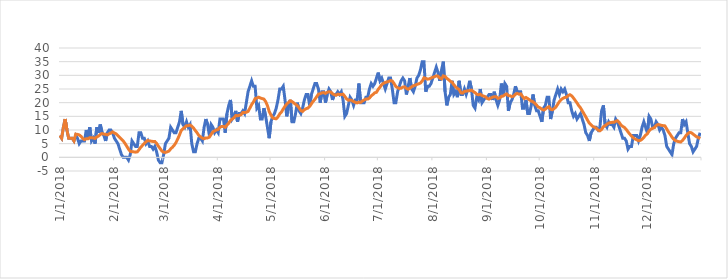
| Category | TEMPERATURE | Moyenne |
|---|---|---|
| 1/1/18 | 8 | 8 |
| 1/2/18 | 7 | 7 |
| 1/3/18 | 11 | 11 |
| 1/4/18 | 14 | 14 |
| 1/5/18 | 10 | 10 |
| 1/6/18 | 7 | 7 |
| 1/7/18 | 7 | 7 |
| 1/8/18 | 7 | 7 |
| 1/9/18 | 6 | 6 |
| 1/10/18 | 8 | 8.5 |
| 1/11/18 | 7 | 8.4 |
| 1/12/18 | 5 | 8.2 |
| 1/13/18 | 6 | 7.7 |
| 1/14/18 | 6 | 6.9 |
| 1/15/18 | 6 | 6.5 |
| 1/16/18 | 10 | 6.8 |
| 1/17/18 | 7 | 6.8 |
| 1/18/18 | 11 | 7.2 |
| 1/19/18 | 6 | 7.2 |
| 1/20/18 | 7 | 7.1 |
| 1/21/18 | 5 | 6.9 |
| 1/22/18 | 11 | 7.5 |
| 1/23/18 | 9 | 7.8 |
| 1/24/18 | 12 | 8.4 |
| 1/25/18 | 9 | 8.7 |
| 1/26/18 | 8 | 8.5 |
| 1/27/18 | 6 | 8.4 |
| 1/28/18 | 9 | 8.2 |
| 1/29/18 | 10 | 8.6 |
| 1/30/18 | 10 | 8.9 |
| 1/31/18 | 9 | 9.3 |
| 2/1/18 | 7 | 8.9 |
| 2/2/18 | 6 | 8.6 |
| 2/3/18 | 5 | 7.9 |
| 2/4/18 | 3 | 7.3 |
| 2/5/18 | 1 | 6.6 |
| 2/6/18 | 0 | 6 |
| 2/7/18 | 0 | 5.1 |
| 2/8/18 | 0 | 4.1 |
| 2/9/18 | -1 | 3 |
| 2/10/18 | 1 | 2.2 |
| 2/11/18 | 6 | 2.1 |
| 2/12/18 | 5 | 2 |
| 2/13/18 | 4 | 1.9 |
| 2/14/18 | 4 | 2 |
| 2/15/18 | 9 | 2.8 |
| 2/16/18 | 9 | 3.7 |
| 2/17/18 | 7 | 4.4 |
| 2/18/18 | 7 | 5.1 |
| 2/19/18 | 5 | 5.7 |
| 2/20/18 | 6 | 6.2 |
| 2/21/18 | 4 | 6 |
| 2/22/18 | 4 | 5.9 |
| 2/23/18 | 3 | 5.8 |
| 2/24/18 | 4 | 5.8 |
| 2/25/18 | 2 | 5.1 |
| 2/26/18 | -1 | 4.1 |
| 2/27/18 | -2 | 3.2 |
| 2/28/18 | -2 | 2.3 |
| 3/1/18 | 1 | 1.9 |
| 3/2/18 | 5 | 1.8 |
| 3/3/18 | 6 | 2 |
| 3/4/18 | 7 | 2.3 |
| 3/5/18 | 11 | 3.1 |
| 3/6/18 | 10 | 3.7 |
| 3/7/18 | 9 | 4.4 |
| 3/8/18 | 9 | 5.4 |
| 3/9/18 | 11 | 6.7 |
| 3/10/18 | 13 | 8.2 |
| 3/11/18 | 17 | 9.8 |
| 3/12/18 | 12 | 10.5 |
| 3/13/18 | 11 | 11 |
| 3/14/18 | 13 | 11.6 |
| 3/15/18 | 11 | 11.6 |
| 3/16/18 | 12 | 11.8 |
| 3/17/18 | 5 | 11.4 |
| 3/18/18 | 2 | 10.7 |
| 3/19/18 | 2 | 9.8 |
| 3/20/18 | 5 | 9 |
| 3/21/18 | 7 | 8 |
| 3/22/18 | 7 | 7.5 |
| 3/23/18 | 6 | 7 |
| 3/24/18 | 11 | 6.8 |
| 3/25/18 | 14 | 7.1 |
| 3/26/18 | 12 | 7.1 |
| 3/27/18 | 8 | 7.4 |
| 3/28/18 | 12 | 8.4 |
| 3/29/18 | 11 | 9.3 |
| 3/30/18 | 9 | 9.7 |
| 3/31/18 | 10 | 10 |
| 4/1/18 | 9 | 10.2 |
| 4/2/18 | 14 | 11 |
| 4/3/18 | 14 | 11.3 |
| 4/4/18 | 14 | 11.3 |
| 4/5/18 | 9 | 11 |
| 4/6/18 | 16 | 11.8 |
| 4/7/18 | 19 | 12.5 |
| 4/8/18 | 21 | 13.5 |
| 4/9/18 | 14 | 14 |
| 4/10/18 | 15 | 14.5 |
| 4/11/18 | 17 | 15.3 |
| 4/12/18 | 13 | 15.2 |
| 4/13/18 | 16 | 15.4 |
| 4/14/18 | 16 | 15.6 |
| 4/15/18 | 17 | 16.4 |
| 4/16/18 | 16 | 16.4 |
| 4/17/18 | 20 | 16.5 |
| 4/18/18 | 24 | 16.8 |
| 4/19/18 | 26 | 18 |
| 4/20/18 | 28 | 19.3 |
| 4/21/18 | 26 | 20.2 |
| 4/22/18 | 26 | 21.5 |
| 4/23/18 | 18 | 21.7 |
| 4/24/18 | 19 | 22 |
| 4/25/18 | 14 | 21.7 |
| 4/26/18 | 14 | 21.5 |
| 4/27/18 | 18 | 21.3 |
| 4/28/18 | 15 | 20.4 |
| 4/29/18 | 11 | 18.9 |
| 4/30/18 | 7 | 16.8 |
| 5/1/18 | 13 | 15.5 |
| 5/2/18 | 15 | 14.4 |
| 5/3/18 | 16 | 14.2 |
| 5/4/18 | 18 | 14.1 |
| 5/5/18 | 21 | 14.8 |
| 5/6/18 | 25 | 15.9 |
| 5/7/18 | 25 | 16.6 |
| 5/8/18 | 26 | 17.7 |
| 5/9/18 | 21 | 18.7 |
| 5/10/18 | 15 | 19.5 |
| 5/11/18 | 19 | 20.1 |
| 5/12/18 | 21 | 20.7 |
| 5/13/18 | 13 | 20.4 |
| 5/14/18 | 13 | 19.9 |
| 5/15/18 | 16 | 19.4 |
| 5/16/18 | 20 | 18.9 |
| 5/17/18 | 17 | 18.1 |
| 5/18/18 | 16 | 17.1 |
| 5/19/18 | 18 | 16.8 |
| 5/20/18 | 21 | 17.4 |
| 5/21/18 | 23 | 17.8 |
| 5/22/18 | 23 | 18 |
| 5/23/18 | 19 | 18.6 |
| 5/24/18 | 23 | 19.6 |
| 5/25/18 | 25 | 20.5 |
| 5/26/18 | 27 | 21.2 |
| 5/27/18 | 27 | 22.2 |
| 5/28/18 | 25 | 23.1 |
| 5/29/18 | 20 | 23.3 |
| 5/30/18 | 24 | 23.6 |
| 5/31/18 | 24 | 23.7 |
| 6/1/18 | 20 | 23.4 |
| 6/2/18 | 23 | 23.8 |
| 6/3/18 | 25 | 24 |
| 6/4/18 | 24 | 23.9 |
| 6/5/18 | 21 | 23.3 |
| 6/6/18 | 23 | 22.9 |
| 6/7/18 | 23 | 22.7 |
| 6/8/18 | 24 | 23.1 |
| 6/9/18 | 23 | 23 |
| 6/10/18 | 24 | 23 |
| 6/11/18 | 21 | 23.1 |
| 6/12/18 | 15 | 22.3 |
| 6/13/18 | 16 | 21.4 |
| 6/14/18 | 19 | 20.9 |
| 6/15/18 | 22 | 21 |
| 6/16/18 | 21 | 20.8 |
| 6/17/18 | 19 | 20.4 |
| 6/18/18 | 21 | 20.1 |
| 6/19/18 | 21 | 19.9 |
| 6/20/18 | 27 | 20.2 |
| 6/21/18 | 20 | 20.1 |
| 6/22/18 | 20 | 20.6 |
| 6/23/18 | 20 | 21 |
| 6/24/18 | 22 | 21.3 |
| 6/25/18 | 22 | 21.3 |
| 6/26/18 | 25 | 21.7 |
| 6/27/18 | 27 | 22.5 |
| 6/28/18 | 26 | 23 |
| 6/29/18 | 27 | 23.6 |
| 6/30/18 | 29 | 23.8 |
| 7/1/18 | 31 | 24.9 |
| 7/2/18 | 28 | 25.7 |
| 7/3/18 | 29 | 26.6 |
| 7/4/18 | 27 | 27.1 |
| 7/5/18 | 25 | 27.4 |
| 7/6/18 | 27 | 27.6 |
| 7/7/18 | 29 | 27.8 |
| 7/8/18 | 29 | 28.1 |
| 7/9/18 | 25 | 27.9 |
| 7/10/18 | 20 | 27 |
| 7/11/18 | 20 | 25.9 |
| 7/12/18 | 24 | 25.5 |
| 7/13/18 | 26 | 25.2 |
| 7/14/18 | 28 | 25.3 |
| 7/15/18 | 29 | 25.7 |
| 7/16/18 | 28 | 25.8 |
| 7/17/18 | 23 | 25.2 |
| 7/18/18 | 26 | 24.9 |
| 7/19/18 | 29 | 25.3 |
| 7/20/18 | 25 | 25.8 |
| 7/21/18 | 24 | 26.2 |
| 7/22/18 | 26 | 26.4 |
| 7/23/18 | 29 | 26.7 |
| 7/24/18 | 30 | 26.9 |
| 7/25/18 | 32 | 27.2 |
| 7/26/18 | 35 | 27.9 |
| 7/27/18 | 35 | 29.1 |
| 7/28/18 | 24 | 28.9 |
| 7/29/18 | 26 | 28.6 |
| 7/30/18 | 26 | 28.7 |
| 7/31/18 | 27 | 29 |
| 8/1/18 | 29 | 29.3 |
| 8/2/18 | 31 | 29.5 |
| 8/3/18 | 33 | 29.8 |
| 8/4/18 | 31 | 29.7 |
| 8/5/18 | 28 | 29 |
| 8/6/18 | 32 | 28.7 |
| 8/7/18 | 35 | 29.8 |
| 8/8/18 | 24 | 29.6 |
| 8/9/18 | 19 | 28.9 |
| 8/10/18 | 22 | 28.4 |
| 8/11/18 | 23 | 27.8 |
| 8/12/18 | 28 | 27.5 |
| 8/13/18 | 23 | 26.5 |
| 8/14/18 | 24 | 25.8 |
| 8/15/18 | 22 | 25.2 |
| 8/16/18 | 28 | 24.8 |
| 8/17/18 | 23 | 23.6 |
| 8/18/18 | 23 | 23.5 |
| 8/19/18 | 25 | 24.1 |
| 8/20/18 | 23 | 24.2 |
| 8/21/18 | 25 | 24.4 |
| 8/22/18 | 28 | 24.4 |
| 8/23/18 | 25 | 24.6 |
| 8/24/18 | 19 | 24.1 |
| 8/25/18 | 18 | 23.7 |
| 8/26/18 | 22 | 23.1 |
| 8/27/18 | 21 | 22.9 |
| 8/28/18 | 25 | 23.1 |
| 8/29/18 | 20 | 22.6 |
| 8/30/18 | 21 | 22.4 |
| 8/31/18 | 22 | 22.1 |
| 9/1/18 | 22 | 21.5 |
| 9/2/18 | 23 | 21.3 |
| 9/3/18 | 23 | 21.7 |
| 9/4/18 | 21 | 22 |
| 9/5/18 | 24 | 22.2 |
| 9/6/18 | 21 | 22.2 |
| 9/7/18 | 19 | 21.6 |
| 9/8/18 | 21 | 21.7 |
| 9/9/18 | 27 | 22.3 |
| 9/10/18 | 23 | 22.4 |
| 9/11/18 | 27 | 22.9 |
| 9/12/18 | 26 | 23.2 |
| 9/13/18 | 17 | 22.6 |
| 9/14/18 | 20 | 22.5 |
| 9/15/18 | 21 | 22.2 |
| 9/16/18 | 23 | 22.4 |
| 9/17/18 | 26 | 23.1 |
| 9/18/18 | 24 | 23.4 |
| 9/19/18 | 24 | 23.1 |
| 9/20/18 | 24 | 23.2 |
| 9/21/18 | 18 | 22.3 |
| 9/22/18 | 18 | 21.5 |
| 9/23/18 | 21 | 21.9 |
| 9/24/18 | 16 | 21.5 |
| 9/25/18 | 16 | 21 |
| 9/26/18 | 19 | 20.6 |
| 9/27/18 | 23 | 20.3 |
| 9/28/18 | 19 | 19.8 |
| 9/29/18 | 17 | 19.1 |
| 9/30/18 | 17 | 18.4 |
| 10/1/18 | 15 | 18.1 |
| 10/2/18 | 13 | 17.6 |
| 10/3/18 | 18 | 17.3 |
| 10/4/18 | 19 | 17.6 |
| 10/5/18 | 22 | 18.2 |
| 10/6/18 | 22 | 18.5 |
| 10/7/18 | 14 | 17.6 |
| 10/8/18 | 17 | 17.4 |
| 10/9/18 | 21 | 17.8 |
| 10/10/18 | 23 | 18.4 |
| 10/11/18 | 25 | 19.4 |
| 10/12/18 | 23 | 20.4 |
| 10/13/18 | 25 | 21.1 |
| 10/14/18 | 24 | 21.6 |
| 10/15/18 | 25 | 21.9 |
| 10/16/18 | 23 | 22 |
| 10/17/18 | 20 | 22.6 |
| 10/18/18 | 20 | 22.9 |
| 10/19/18 | 17 | 22.5 |
| 10/20/18 | 15 | 21.7 |
| 10/21/18 | 16 | 20.8 |
| 10/22/18 | 14 | 19.9 |
| 10/23/18 | 15 | 18.9 |
| 10/24/18 | 16 | 18.1 |
| 10/25/18 | 14 | 17 |
| 10/26/18 | 12 | 15.9 |
| 10/27/18 | 9 | 14.8 |
| 10/28/18 | 8 | 13.6 |
| 10/29/18 | 6 | 12.5 |
| 10/30/18 | 9 | 11.9 |
| 10/31/18 | 10 | 11.3 |
| 11/1/18 | 11 | 11 |
| 11/2/18 | 11 | 10.6 |
| 11/3/18 | 10 | 10 |
| 11/4/18 | 11 | 9.7 |
| 11/5/18 | 17 | 10.2 |
| 11/6/18 | 19 | 11.2 |
| 11/7/18 | 12 | 11.6 |
| 11/8/18 | 11 | 12.1 |
| 11/9/18 | 13 | 12.5 |
| 11/10/18 | 12 | 12.7 |
| 11/11/18 | 12 | 12.8 |
| 11/12/18 | 11 | 12.8 |
| 11/13/18 | 14 | 13.2 |
| 11/14/18 | 13 | 13.4 |
| 11/15/18 | 11 | 12.8 |
| 11/16/18 | 9 | 11.8 |
| 11/17/18 | 7 | 11.3 |
| 11/18/18 | 7 | 10.9 |
| 11/19/18 | 6 | 10.2 |
| 11/20/18 | 3 | 9.3 |
| 11/21/18 | 4 | 8.5 |
| 11/22/18 | 4 | 7.8 |
| 11/23/18 | 8 | 7.2 |
| 11/24/18 | 8 | 6.7 |
| 11/25/18 | 8 | 6.4 |
| 11/26/18 | 6 | 6.1 |
| 11/27/18 | 8 | 6.2 |
| 11/28/18 | 11 | 6.6 |
| 11/29/18 | 13 | 7.3 |
| 11/30/18 | 11 | 8.1 |
| 12/1/18 | 9 | 8.6 |
| 12/2/18 | 15 | 9.7 |
| 12/3/18 | 14 | 10.3 |
| 12/4/18 | 11 | 10.6 |
| 12/5/18 | 11 | 10.9 |
| 12/6/18 | 13 | 11.6 |
| 12/7/18 | 12 | 12 |
| 12/8/18 | 10 | 11.9 |
| 12/9/18 | 11 | 11.7 |
| 12/10/18 | 10 | 11.6 |
| 12/11/18 | 8 | 11.5 |
| 12/12/18 | 4 | 10.4 |
| 12/13/18 | 3 | 9.3 |
| 12/14/18 | 2 | 8.4 |
| 12/15/18 | 1 | 7.4 |
| 12/16/18 | 5 | 6.6 |
| 12/17/18 | 7 | 6.1 |
| 12/18/18 | 8 | 5.9 |
| 12/19/18 | 9 | 5.7 |
| 12/20/18 | 9 | 5.6 |
| 12/21/18 | 14 | 6.2 |
| 12/22/18 | 12 | 7 |
| 12/23/18 | 13 | 8 |
| 12/24/18 | 9 | 8.7 |
| 12/25/18 | 5 | 9.1 |
| 12/26/18 | 4 | 9 |
| 12/27/18 | 2 | 8.5 |
| 12/28/18 | 3 | 8 |
| 12/29/18 | 4 | 7.5 |
| 12/30/18 | 7 | 7.3 |
| 12/31/18 | 9 | 6.8 |